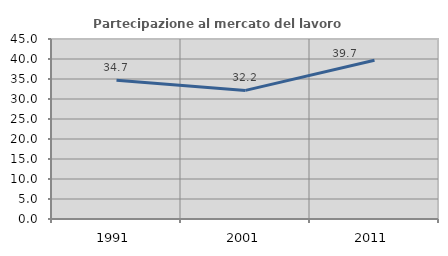
| Category | Partecipazione al mercato del lavoro  femminile |
|---|---|
| 1991.0 | 34.659 |
| 2001.0 | 32.153 |
| 2011.0 | 39.683 |